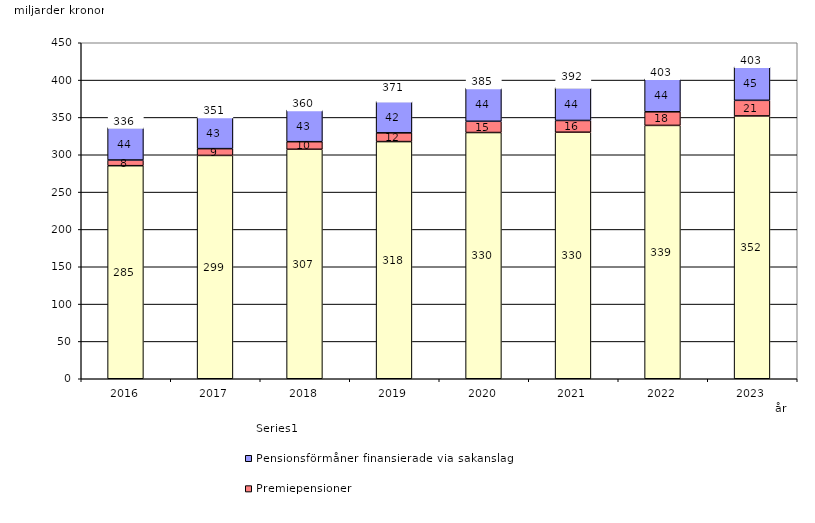
| Category | Inkomstpension och tilläggspension m.m. | Premiepensioner | Pensionsförmåner finansierade via sakanslag | Series 0 |
|---|---|---|---|---|
| 2016.0 | 285.357 | 7.598 | 43.541 | 20 |
| 2017.0 | 299.103 | 9.081 | 42.508 | 20 |
| 2018.0 | 307.356 | 10.141 | 42.538 | 20 |
| 2019.0 | 317.628 | 11.715 | 42.209 | 20 |
| 2020.0 | 329.769 | 15.069 | 44.443 | 20 |
| 2021.0 | 330.164 | 15.749 | 43.992 | 20 |
| 2022.0 | 339.308 | 18.225 | 44.232 | 20 |
| 2023.0 | 351.989 | 20.914 | 44.93 | 20 |